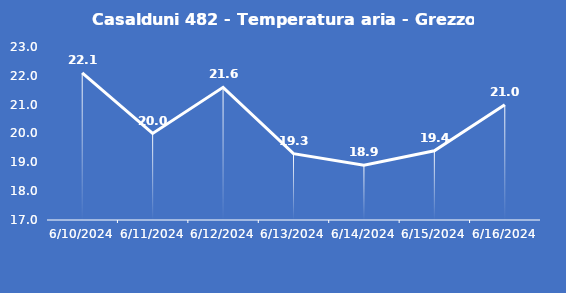
| Category | Casalduni 482 - Temperatura aria - Grezzo (°C) |
|---|---|
| 6/10/24 | 22.1 |
| 6/11/24 | 20 |
| 6/12/24 | 21.6 |
| 6/13/24 | 19.3 |
| 6/14/24 | 18.9 |
| 6/15/24 | 19.4 |
| 6/16/24 | 21 |